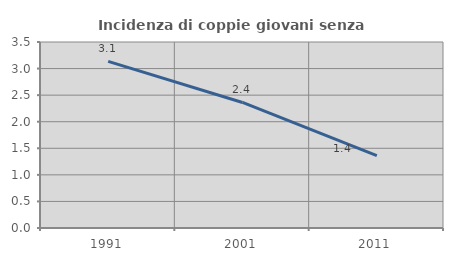
| Category | Incidenza di coppie giovani senza figli |
|---|---|
| 1991.0 | 3.136 |
| 2001.0 | 2.362 |
| 2011.0 | 1.364 |